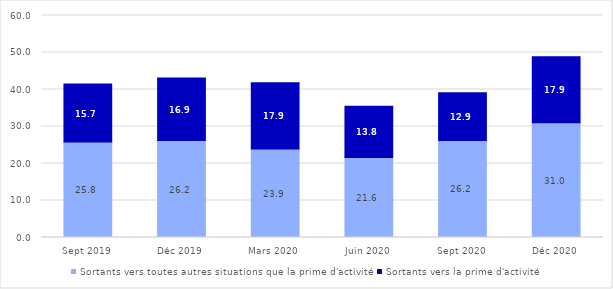
| Category | Sortants vers toutes autres situations que la prime d'activité  | Sortants vers la prime d'activité |
|---|---|---|
| Sept 2019 | 25.79 | 15.709 |
| Déc 2019 | 26.203 | 16.932 |
| Mars 2020 | 23.905 | 17.917 |
| Juin 2020 | 21.643 | 13.842 |
| Sept 2020 | 26.222 | 12.872 |
| Déc 2020 | 31.007 | 17.859 |